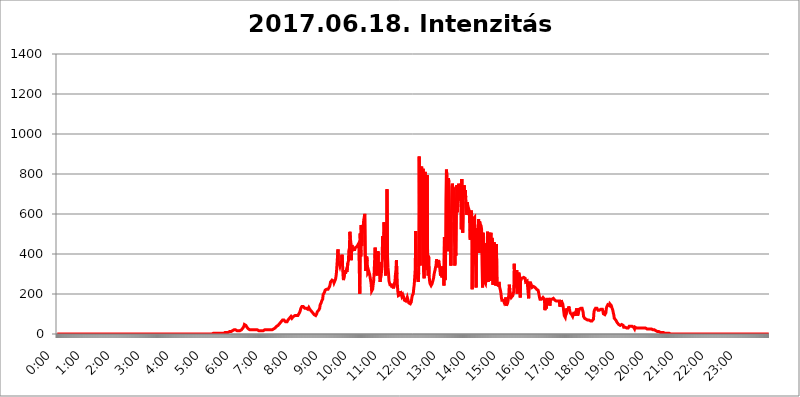
| Category | 2017.06.18. Intenzitás [W/m^2]04 |
|---|---|
| 0.0 | 0 |
| 0.0006944444444444445 | 0 |
| 0.001388888888888889 | 0 |
| 0.0020833333333333333 | 0 |
| 0.002777777777777778 | 0 |
| 0.003472222222222222 | 0 |
| 0.004166666666666667 | 0 |
| 0.004861111111111111 | 0 |
| 0.005555555555555556 | 0 |
| 0.0062499999999999995 | 0 |
| 0.006944444444444444 | 0 |
| 0.007638888888888889 | 0 |
| 0.008333333333333333 | 0 |
| 0.009027777777777779 | 0 |
| 0.009722222222222222 | 0 |
| 0.010416666666666666 | 0 |
| 0.011111111111111112 | 0 |
| 0.011805555555555555 | 0 |
| 0.012499999999999999 | 0 |
| 0.013194444444444444 | 0 |
| 0.013888888888888888 | 0 |
| 0.014583333333333332 | 0 |
| 0.015277777777777777 | 0 |
| 0.015972222222222224 | 0 |
| 0.016666666666666666 | 0 |
| 0.017361111111111112 | 0 |
| 0.018055555555555557 | 0 |
| 0.01875 | 0 |
| 0.019444444444444445 | 0 |
| 0.02013888888888889 | 0 |
| 0.020833333333333332 | 0 |
| 0.02152777777777778 | 0 |
| 0.022222222222222223 | 0 |
| 0.02291666666666667 | 0 |
| 0.02361111111111111 | 0 |
| 0.024305555555555556 | 0 |
| 0.024999999999999998 | 0 |
| 0.025694444444444447 | 0 |
| 0.02638888888888889 | 0 |
| 0.027083333333333334 | 0 |
| 0.027777777777777776 | 0 |
| 0.02847222222222222 | 0 |
| 0.029166666666666664 | 0 |
| 0.029861111111111113 | 0 |
| 0.030555555555555555 | 0 |
| 0.03125 | 0 |
| 0.03194444444444445 | 0 |
| 0.03263888888888889 | 0 |
| 0.03333333333333333 | 0 |
| 0.034027777777777775 | 0 |
| 0.034722222222222224 | 0 |
| 0.035416666666666666 | 0 |
| 0.036111111111111115 | 0 |
| 0.03680555555555556 | 0 |
| 0.0375 | 0 |
| 0.03819444444444444 | 0 |
| 0.03888888888888889 | 0 |
| 0.03958333333333333 | 0 |
| 0.04027777777777778 | 0 |
| 0.04097222222222222 | 0 |
| 0.041666666666666664 | 0 |
| 0.042361111111111106 | 0 |
| 0.04305555555555556 | 0 |
| 0.043750000000000004 | 0 |
| 0.044444444444444446 | 0 |
| 0.04513888888888889 | 0 |
| 0.04583333333333334 | 0 |
| 0.04652777777777778 | 0 |
| 0.04722222222222222 | 0 |
| 0.04791666666666666 | 0 |
| 0.04861111111111111 | 0 |
| 0.049305555555555554 | 0 |
| 0.049999999999999996 | 0 |
| 0.05069444444444445 | 0 |
| 0.051388888888888894 | 0 |
| 0.052083333333333336 | 0 |
| 0.05277777777777778 | 0 |
| 0.05347222222222222 | 0 |
| 0.05416666666666667 | 0 |
| 0.05486111111111111 | 0 |
| 0.05555555555555555 | 0 |
| 0.05625 | 0 |
| 0.05694444444444444 | 0 |
| 0.057638888888888885 | 0 |
| 0.05833333333333333 | 0 |
| 0.05902777777777778 | 0 |
| 0.059722222222222225 | 0 |
| 0.06041666666666667 | 0 |
| 0.061111111111111116 | 0 |
| 0.06180555555555556 | 0 |
| 0.0625 | 0 |
| 0.06319444444444444 | 0 |
| 0.06388888888888888 | 0 |
| 0.06458333333333334 | 0 |
| 0.06527777777777778 | 0 |
| 0.06597222222222222 | 0 |
| 0.06666666666666667 | 0 |
| 0.06736111111111111 | 0 |
| 0.06805555555555555 | 0 |
| 0.06874999999999999 | 0 |
| 0.06944444444444443 | 0 |
| 0.07013888888888889 | 0 |
| 0.07083333333333333 | 0 |
| 0.07152777777777779 | 0 |
| 0.07222222222222223 | 0 |
| 0.07291666666666667 | 0 |
| 0.07361111111111111 | 0 |
| 0.07430555555555556 | 0 |
| 0.075 | 0 |
| 0.07569444444444444 | 0 |
| 0.0763888888888889 | 0 |
| 0.07708333333333334 | 0 |
| 0.07777777777777778 | 0 |
| 0.07847222222222222 | 0 |
| 0.07916666666666666 | 0 |
| 0.0798611111111111 | 0 |
| 0.08055555555555556 | 0 |
| 0.08125 | 0 |
| 0.08194444444444444 | 0 |
| 0.08263888888888889 | 0 |
| 0.08333333333333333 | 0 |
| 0.08402777777777777 | 0 |
| 0.08472222222222221 | 0 |
| 0.08541666666666665 | 0 |
| 0.08611111111111112 | 0 |
| 0.08680555555555557 | 0 |
| 0.08750000000000001 | 0 |
| 0.08819444444444445 | 0 |
| 0.08888888888888889 | 0 |
| 0.08958333333333333 | 0 |
| 0.09027777777777778 | 0 |
| 0.09097222222222222 | 0 |
| 0.09166666666666667 | 0 |
| 0.09236111111111112 | 0 |
| 0.09305555555555556 | 0 |
| 0.09375 | 0 |
| 0.09444444444444444 | 0 |
| 0.09513888888888888 | 0 |
| 0.09583333333333333 | 0 |
| 0.09652777777777777 | 0 |
| 0.09722222222222222 | 0 |
| 0.09791666666666667 | 0 |
| 0.09861111111111111 | 0 |
| 0.09930555555555555 | 0 |
| 0.09999999999999999 | 0 |
| 0.10069444444444443 | 0 |
| 0.1013888888888889 | 0 |
| 0.10208333333333335 | 0 |
| 0.10277777777777779 | 0 |
| 0.10347222222222223 | 0 |
| 0.10416666666666667 | 0 |
| 0.10486111111111111 | 0 |
| 0.10555555555555556 | 0 |
| 0.10625 | 0 |
| 0.10694444444444444 | 0 |
| 0.1076388888888889 | 0 |
| 0.10833333333333334 | 0 |
| 0.10902777777777778 | 0 |
| 0.10972222222222222 | 0 |
| 0.1111111111111111 | 0 |
| 0.11180555555555556 | 0 |
| 0.11180555555555556 | 0 |
| 0.1125 | 0 |
| 0.11319444444444444 | 0 |
| 0.11388888888888889 | 0 |
| 0.11458333333333333 | 0 |
| 0.11527777777777777 | 0 |
| 0.11597222222222221 | 0 |
| 0.11666666666666665 | 0 |
| 0.1173611111111111 | 0 |
| 0.11805555555555557 | 0 |
| 0.11944444444444445 | 0 |
| 0.12013888888888889 | 0 |
| 0.12083333333333333 | 0 |
| 0.12152777777777778 | 0 |
| 0.12222222222222223 | 0 |
| 0.12291666666666667 | 0 |
| 0.12291666666666667 | 0 |
| 0.12361111111111112 | 0 |
| 0.12430555555555556 | 0 |
| 0.125 | 0 |
| 0.12569444444444444 | 0 |
| 0.12638888888888888 | 0 |
| 0.12708333333333333 | 0 |
| 0.16875 | 0 |
| 0.12847222222222224 | 0 |
| 0.12916666666666668 | 0 |
| 0.12986111111111112 | 0 |
| 0.13055555555555556 | 0 |
| 0.13125 | 0 |
| 0.13194444444444445 | 0 |
| 0.1326388888888889 | 0 |
| 0.13333333333333333 | 0 |
| 0.13402777777777777 | 0 |
| 0.13402777777777777 | 0 |
| 0.13472222222222222 | 0 |
| 0.13541666666666666 | 0 |
| 0.1361111111111111 | 0 |
| 0.13749999999999998 | 0 |
| 0.13819444444444443 | 0 |
| 0.1388888888888889 | 0 |
| 0.13958333333333334 | 0 |
| 0.14027777777777778 | 0 |
| 0.14097222222222222 | 0 |
| 0.14166666666666666 | 0 |
| 0.1423611111111111 | 0 |
| 0.14305555555555557 | 0 |
| 0.14375000000000002 | 0 |
| 0.14444444444444446 | 0 |
| 0.1451388888888889 | 0 |
| 0.1451388888888889 | 0 |
| 0.14652777777777778 | 0 |
| 0.14722222222222223 | 0 |
| 0.14791666666666667 | 0 |
| 0.1486111111111111 | 0 |
| 0.14930555555555555 | 0 |
| 0.15 | 0 |
| 0.15069444444444444 | 0 |
| 0.15138888888888888 | 0 |
| 0.15208333333333332 | 0 |
| 0.15277777777777776 | 0 |
| 0.15347222222222223 | 0 |
| 0.15416666666666667 | 0 |
| 0.15486111111111112 | 0 |
| 0.15555555555555556 | 0 |
| 0.15625 | 0 |
| 0.15694444444444444 | 0 |
| 0.15763888888888888 | 0 |
| 0.15833333333333333 | 0 |
| 0.15902777777777777 | 0 |
| 0.15972222222222224 | 0 |
| 0.16041666666666668 | 0 |
| 0.16111111111111112 | 0 |
| 0.16180555555555556 | 0 |
| 0.1625 | 0 |
| 0.16319444444444445 | 0 |
| 0.1638888888888889 | 0 |
| 0.16458333333333333 | 0 |
| 0.16527777777777777 | 0 |
| 0.16597222222222222 | 0 |
| 0.16666666666666666 | 0 |
| 0.1673611111111111 | 0 |
| 0.16805555555555554 | 0 |
| 0.16874999999999998 | 0 |
| 0.16944444444444443 | 0 |
| 0.17013888888888887 | 0 |
| 0.1708333333333333 | 0 |
| 0.17152777777777775 | 0 |
| 0.17222222222222225 | 0 |
| 0.1729166666666667 | 0 |
| 0.17361111111111113 | 0 |
| 0.17430555555555557 | 0 |
| 0.17500000000000002 | 0 |
| 0.17569444444444446 | 0 |
| 0.1763888888888889 | 0 |
| 0.17708333333333334 | 0 |
| 0.17777777777777778 | 0 |
| 0.17847222222222223 | 0 |
| 0.17916666666666667 | 0 |
| 0.1798611111111111 | 0 |
| 0.18055555555555555 | 0 |
| 0.18125 | 0 |
| 0.18194444444444444 | 0 |
| 0.1826388888888889 | 0 |
| 0.18333333333333335 | 0 |
| 0.1840277777777778 | 0 |
| 0.18472222222222223 | 0 |
| 0.18541666666666667 | 0 |
| 0.18611111111111112 | 0 |
| 0.18680555555555556 | 0 |
| 0.1875 | 0 |
| 0.18819444444444444 | 0 |
| 0.18888888888888888 | 0 |
| 0.18958333333333333 | 0 |
| 0.19027777777777777 | 0 |
| 0.1909722222222222 | 0 |
| 0.19166666666666665 | 0 |
| 0.19236111111111112 | 0 |
| 0.19305555555555554 | 0 |
| 0.19375 | 0 |
| 0.19444444444444445 | 0 |
| 0.1951388888888889 | 0 |
| 0.19583333333333333 | 0 |
| 0.19652777777777777 | 0 |
| 0.19722222222222222 | 0 |
| 0.19791666666666666 | 0 |
| 0.1986111111111111 | 0 |
| 0.19930555555555554 | 0 |
| 0.19999999999999998 | 0 |
| 0.20069444444444443 | 0 |
| 0.20138888888888887 | 0 |
| 0.2020833333333333 | 0 |
| 0.2027777777777778 | 0 |
| 0.2034722222222222 | 0 |
| 0.2041666666666667 | 0 |
| 0.20486111111111113 | 0 |
| 0.20555555555555557 | 0 |
| 0.20625000000000002 | 0 |
| 0.20694444444444446 | 0 |
| 0.2076388888888889 | 0 |
| 0.20833333333333334 | 0 |
| 0.20902777777777778 | 0 |
| 0.20972222222222223 | 0 |
| 0.21041666666666667 | 0 |
| 0.2111111111111111 | 0 |
| 0.21180555555555555 | 0 |
| 0.2125 | 0 |
| 0.21319444444444444 | 0 |
| 0.2138888888888889 | 0 |
| 0.21458333333333335 | 0 |
| 0.2152777777777778 | 0 |
| 0.21597222222222223 | 0 |
| 0.21666666666666667 | 0 |
| 0.21736111111111112 | 0 |
| 0.21805555555555556 | 3.525 |
| 0.21875 | 3.525 |
| 0.21944444444444444 | 3.525 |
| 0.22013888888888888 | 3.525 |
| 0.22083333333333333 | 3.525 |
| 0.22152777777777777 | 3.525 |
| 0.2222222222222222 | 3.525 |
| 0.22291666666666665 | 3.525 |
| 0.2236111111111111 | 3.525 |
| 0.22430555555555556 | 3.525 |
| 0.225 | 3.525 |
| 0.22569444444444445 | 3.525 |
| 0.2263888888888889 | 3.525 |
| 0.22708333333333333 | 3.525 |
| 0.22777777777777777 | 3.525 |
| 0.22847222222222222 | 3.525 |
| 0.22916666666666666 | 3.525 |
| 0.2298611111111111 | 3.525 |
| 0.23055555555555554 | 3.525 |
| 0.23124999999999998 | 3.525 |
| 0.23194444444444443 | 3.525 |
| 0.23263888888888887 | 3.525 |
| 0.2333333333333333 | 3.525 |
| 0.2340277777777778 | 3.525 |
| 0.2347222222222222 | 3.525 |
| 0.2354166666666667 | 7.887 |
| 0.23611111111111113 | 3.525 |
| 0.23680555555555557 | 7.887 |
| 0.23750000000000002 | 7.887 |
| 0.23819444444444446 | 7.887 |
| 0.2388888888888889 | 7.887 |
| 0.23958333333333334 | 7.887 |
| 0.24027777777777778 | 7.887 |
| 0.24097222222222223 | 12.257 |
| 0.24166666666666667 | 12.257 |
| 0.2423611111111111 | 12.257 |
| 0.24305555555555555 | 12.257 |
| 0.24375 | 12.257 |
| 0.24444444444444446 | 16.636 |
| 0.24513888888888888 | 16.636 |
| 0.24583333333333335 | 16.636 |
| 0.2465277777777778 | 21.024 |
| 0.24722222222222223 | 21.024 |
| 0.24791666666666667 | 21.024 |
| 0.24861111111111112 | 16.636 |
| 0.24930555555555556 | 21.024 |
| 0.25 | 21.024 |
| 0.25069444444444444 | 21.024 |
| 0.2513888888888889 | 16.636 |
| 0.2520833333333333 | 16.636 |
| 0.25277777777777777 | 16.636 |
| 0.2534722222222222 | 16.636 |
| 0.25416666666666665 | 16.636 |
| 0.2548611111111111 | 16.636 |
| 0.2555555555555556 | 16.636 |
| 0.25625000000000003 | 16.636 |
| 0.2569444444444445 | 16.636 |
| 0.2576388888888889 | 16.636 |
| 0.25833333333333336 | 21.024 |
| 0.2590277777777778 | 21.024 |
| 0.25972222222222224 | 25.419 |
| 0.2604166666666667 | 29.823 |
| 0.2611111111111111 | 34.234 |
| 0.26180555555555557 | 38.653 |
| 0.2625 | 47.511 |
| 0.26319444444444445 | 47.511 |
| 0.2638888888888889 | 47.511 |
| 0.26458333333333334 | 43.079 |
| 0.2652777777777778 | 38.653 |
| 0.2659722222222222 | 34.234 |
| 0.26666666666666666 | 34.234 |
| 0.2673611111111111 | 29.823 |
| 0.26805555555555555 | 25.419 |
| 0.26875 | 25.419 |
| 0.26944444444444443 | 25.419 |
| 0.2701388888888889 | 21.024 |
| 0.2708333333333333 | 25.419 |
| 0.27152777777777776 | 21.024 |
| 0.2722222222222222 | 21.024 |
| 0.27291666666666664 | 21.024 |
| 0.2736111111111111 | 21.024 |
| 0.2743055555555555 | 21.024 |
| 0.27499999999999997 | 21.024 |
| 0.27569444444444446 | 21.024 |
| 0.27638888888888885 | 21.024 |
| 0.27708333333333335 | 21.024 |
| 0.2777777777777778 | 21.024 |
| 0.27847222222222223 | 21.024 |
| 0.2791666666666667 | 21.024 |
| 0.2798611111111111 | 21.024 |
| 0.28055555555555556 | 21.024 |
| 0.28125 | 16.636 |
| 0.28194444444444444 | 16.636 |
| 0.2826388888888889 | 16.636 |
| 0.2833333333333333 | 16.636 |
| 0.28402777777777777 | 16.636 |
| 0.2847222222222222 | 16.636 |
| 0.28541666666666665 | 16.636 |
| 0.28611111111111115 | 16.636 |
| 0.28680555555555554 | 16.636 |
| 0.28750000000000003 | 16.636 |
| 0.2881944444444445 | 16.636 |
| 0.2888888888888889 | 16.636 |
| 0.28958333333333336 | 16.636 |
| 0.2902777777777778 | 16.636 |
| 0.29097222222222224 | 21.024 |
| 0.2916666666666667 | 21.024 |
| 0.2923611111111111 | 21.024 |
| 0.29305555555555557 | 21.024 |
| 0.29375 | 21.024 |
| 0.29444444444444445 | 21.024 |
| 0.2951388888888889 | 21.024 |
| 0.29583333333333334 | 21.024 |
| 0.2965277777777778 | 21.024 |
| 0.2972222222222222 | 21.024 |
| 0.29791666666666666 | 21.024 |
| 0.2986111111111111 | 21.024 |
| 0.29930555555555555 | 21.024 |
| 0.3 | 21.024 |
| 0.30069444444444443 | 21.024 |
| 0.3013888888888889 | 21.024 |
| 0.3020833333333333 | 21.024 |
| 0.30277777777777776 | 25.419 |
| 0.3034722222222222 | 25.419 |
| 0.30416666666666664 | 29.823 |
| 0.3048611111111111 | 29.823 |
| 0.3055555555555555 | 29.823 |
| 0.30624999999999997 | 34.234 |
| 0.3069444444444444 | 34.234 |
| 0.3076388888888889 | 38.653 |
| 0.30833333333333335 | 38.653 |
| 0.3090277777777778 | 38.653 |
| 0.30972222222222223 | 43.079 |
| 0.3104166666666667 | 43.079 |
| 0.3111111111111111 | 47.511 |
| 0.31180555555555556 | 51.951 |
| 0.3125 | 56.398 |
| 0.31319444444444444 | 56.398 |
| 0.3138888888888889 | 60.85 |
| 0.3145833333333333 | 65.31 |
| 0.31527777777777777 | 65.31 |
| 0.3159722222222222 | 69.775 |
| 0.31666666666666665 | 69.775 |
| 0.31736111111111115 | 69.775 |
| 0.31805555555555554 | 69.775 |
| 0.31875000000000003 | 65.31 |
| 0.3194444444444445 | 65.31 |
| 0.3201388888888889 | 60.85 |
| 0.32083333333333336 | 60.85 |
| 0.3215277777777778 | 60.85 |
| 0.32222222222222224 | 60.85 |
| 0.3229166666666667 | 65.31 |
| 0.3236111111111111 | 69.775 |
| 0.32430555555555557 | 74.246 |
| 0.325 | 74.246 |
| 0.32569444444444445 | 78.722 |
| 0.3263888888888889 | 78.722 |
| 0.32708333333333334 | 83.205 |
| 0.3277777777777778 | 87.692 |
| 0.3284722222222222 | 83.205 |
| 0.32916666666666666 | 78.722 |
| 0.3298611111111111 | 78.722 |
| 0.33055555555555555 | 83.205 |
| 0.33125 | 87.692 |
| 0.33194444444444443 | 92.184 |
| 0.3326388888888889 | 92.184 |
| 0.3333333333333333 | 92.184 |
| 0.3340277777777778 | 92.184 |
| 0.3347222222222222 | 92.184 |
| 0.3354166666666667 | 92.184 |
| 0.3361111111111111 | 92.184 |
| 0.3368055555555556 | 92.184 |
| 0.33749999999999997 | 92.184 |
| 0.33819444444444446 | 96.682 |
| 0.33888888888888885 | 101.184 |
| 0.33958333333333335 | 105.69 |
| 0.34027777777777773 | 110.201 |
| 0.34097222222222223 | 119.235 |
| 0.3416666666666666 | 128.284 |
| 0.3423611111111111 | 132.814 |
| 0.3430555555555555 | 137.347 |
| 0.34375 | 141.884 |
| 0.3444444444444445 | 141.884 |
| 0.3451388888888889 | 137.347 |
| 0.3458333333333334 | 137.347 |
| 0.34652777777777777 | 132.814 |
| 0.34722222222222227 | 128.284 |
| 0.34791666666666665 | 128.284 |
| 0.34861111111111115 | 128.284 |
| 0.34930555555555554 | 128.284 |
| 0.35000000000000003 | 128.284 |
| 0.3506944444444444 | 123.758 |
| 0.3513888888888889 | 123.758 |
| 0.3520833333333333 | 128.284 |
| 0.3527777777777778 | 132.814 |
| 0.3534722222222222 | 132.814 |
| 0.3541666666666667 | 123.758 |
| 0.3548611111111111 | 119.235 |
| 0.35555555555555557 | 119.235 |
| 0.35625 | 114.716 |
| 0.35694444444444445 | 114.716 |
| 0.3576388888888889 | 110.201 |
| 0.35833333333333334 | 105.69 |
| 0.3590277777777778 | 101.184 |
| 0.3597222222222222 | 101.184 |
| 0.36041666666666666 | 96.682 |
| 0.3611111111111111 | 96.682 |
| 0.36180555555555555 | 96.682 |
| 0.3625 | 92.184 |
| 0.36319444444444443 | 96.682 |
| 0.3638888888888889 | 101.184 |
| 0.3645833333333333 | 110.201 |
| 0.3652777777777778 | 114.716 |
| 0.3659722222222222 | 114.716 |
| 0.3666666666666667 | 119.235 |
| 0.3673611111111111 | 119.235 |
| 0.3680555555555556 | 128.284 |
| 0.36874999999999997 | 146.423 |
| 0.36944444444444446 | 146.423 |
| 0.37013888888888885 | 155.509 |
| 0.37083333333333335 | 164.605 |
| 0.37152777777777773 | 169.156 |
| 0.37222222222222223 | 173.709 |
| 0.3729166666666666 | 196.497 |
| 0.3736111111111111 | 201.058 |
| 0.3743055555555555 | 201.058 |
| 0.375 | 210.182 |
| 0.3756944444444445 | 219.309 |
| 0.3763888888888889 | 214.746 |
| 0.3770833333333334 | 219.309 |
| 0.37777777777777777 | 223.873 |
| 0.37847222222222227 | 219.309 |
| 0.37916666666666665 | 219.309 |
| 0.37986111111111115 | 223.873 |
| 0.38055555555555554 | 228.436 |
| 0.38125000000000003 | 228.436 |
| 0.3819444444444444 | 237.564 |
| 0.3826388888888889 | 246.689 |
| 0.3833333333333333 | 260.373 |
| 0.3840277777777778 | 264.932 |
| 0.3847222222222222 | 264.932 |
| 0.3854166666666667 | 269.49 |
| 0.3861111111111111 | 274.047 |
| 0.38680555555555557 | 269.49 |
| 0.3875 | 264.932 |
| 0.38819444444444445 | 255.813 |
| 0.3888888888888889 | 251.251 |
| 0.38958333333333334 | 260.373 |
| 0.3902777777777778 | 274.047 |
| 0.3909722222222222 | 287.709 |
| 0.39166666666666666 | 310.44 |
| 0.3923611111111111 | 310.44 |
| 0.39305555555555555 | 314.98 |
| 0.39375 | 422.943 |
| 0.39444444444444443 | 346.682 |
| 0.3951388888888889 | 360.221 |
| 0.3958333333333333 | 346.682 |
| 0.3965277777777778 | 337.639 |
| 0.3972222222222222 | 346.682 |
| 0.3979166666666667 | 364.728 |
| 0.3986111111111111 | 342.162 |
| 0.3993055555555556 | 396.164 |
| 0.39999999999999997 | 360.221 |
| 0.40069444444444446 | 301.354 |
| 0.40138888888888885 | 269.49 |
| 0.40208333333333335 | 274.047 |
| 0.40277777777777773 | 296.808 |
| 0.40347222222222223 | 319.517 |
| 0.4041666666666666 | 301.354 |
| 0.4048611111111111 | 310.44 |
| 0.4055555555555555 | 319.517 |
| 0.40625 | 310.44 |
| 0.4069444444444445 | 310.44 |
| 0.4076388888888889 | 355.712 |
| 0.4083333333333334 | 364.728 |
| 0.40902777777777777 | 418.492 |
| 0.40972222222222227 | 427.39 |
| 0.41041666666666665 | 510.885 |
| 0.41111111111111115 | 475.972 |
| 0.41180555555555554 | 458.38 |
| 0.41250000000000003 | 369.23 |
| 0.4131944444444444 | 445.129 |
| 0.4138888888888889 | 431.833 |
| 0.4145833333333333 | 427.39 |
| 0.4152777777777778 | 422.943 |
| 0.4159722222222222 | 422.943 |
| 0.4166666666666667 | 422.943 |
| 0.4173611111111111 | 422.943 |
| 0.41805555555555557 | 431.833 |
| 0.41875 | 431.833 |
| 0.41944444444444445 | 436.27 |
| 0.4201388888888889 | 436.27 |
| 0.42083333333333334 | 440.702 |
| 0.4215277777777778 | 445.129 |
| 0.4222222222222222 | 449.551 |
| 0.42291666666666666 | 453.968 |
| 0.4236111111111111 | 458.38 |
| 0.42430555555555555 | 201.058 |
| 0.425 | 502.192 |
| 0.42569444444444443 | 387.202 |
| 0.4263888888888889 | 545.416 |
| 0.4270833333333333 | 440.702 |
| 0.4277777777777778 | 523.88 |
| 0.4284722222222222 | 523.88 |
| 0.4291666666666667 | 541.121 |
| 0.4298611111111111 | 571.049 |
| 0.4305555555555556 | 583.779 |
| 0.43124999999999997 | 600.661 |
| 0.43194444444444446 | 387.202 |
| 0.43263888888888885 | 314.98 |
| 0.43333333333333335 | 342.162 |
| 0.43402777777777773 | 387.202 |
| 0.43472222222222223 | 364.728 |
| 0.4354166666666666 | 305.898 |
| 0.4361111111111111 | 305.898 |
| 0.4368055555555555 | 314.98 |
| 0.4375 | 305.898 |
| 0.4381944444444445 | 296.808 |
| 0.4388888888888889 | 296.808 |
| 0.4395833333333334 | 301.354 |
| 0.44027777777777777 | 251.251 |
| 0.44097222222222227 | 214.746 |
| 0.44166666666666665 | 214.746 |
| 0.44236111111111115 | 223.873 |
| 0.44305555555555554 | 246.689 |
| 0.44375000000000003 | 264.932 |
| 0.4444444444444444 | 305.898 |
| 0.4451388888888889 | 310.44 |
| 0.4458333333333333 | 431.833 |
| 0.4465277777777778 | 328.584 |
| 0.4472222222222222 | 305.898 |
| 0.4479166666666667 | 305.898 |
| 0.4486111111111111 | 292.259 |
| 0.44930555555555557 | 328.584 |
| 0.45 | 414.035 |
| 0.45069444444444445 | 301.354 |
| 0.4513888888888889 | 360.221 |
| 0.45208333333333334 | 296.808 |
| 0.4527777777777778 | 260.373 |
| 0.4534722222222222 | 278.603 |
| 0.45416666666666666 | 287.709 |
| 0.4548611111111111 | 283.156 |
| 0.45555555555555555 | 342.162 |
| 0.45625 | 489.108 |
| 0.45694444444444443 | 373.729 |
| 0.4576388888888889 | 414.035 |
| 0.4583333333333333 | 558.261 |
| 0.4590277777777778 | 387.202 |
| 0.4597222222222222 | 378.224 |
| 0.4604166666666667 | 292.259 |
| 0.4611111111111111 | 292.259 |
| 0.4618055555555556 | 449.551 |
| 0.46249999999999997 | 723.889 |
| 0.46319444444444446 | 391.685 |
| 0.46388888888888885 | 333.113 |
| 0.46458333333333335 | 305.898 |
| 0.46527777777777773 | 264.932 |
| 0.46597222222222223 | 255.813 |
| 0.4666666666666666 | 246.689 |
| 0.4673611111111111 | 242.127 |
| 0.4680555555555555 | 242.127 |
| 0.46875 | 246.689 |
| 0.4694444444444445 | 233 |
| 0.4701388888888889 | 246.689 |
| 0.4708333333333334 | 242.127 |
| 0.47152777777777777 | 228.436 |
| 0.47222222222222227 | 228.436 |
| 0.47291666666666665 | 233 |
| 0.47361111111111115 | 260.373 |
| 0.47430555555555554 | 296.808 |
| 0.47500000000000003 | 319.517 |
| 0.4756944444444444 | 369.23 |
| 0.4763888888888889 | 301.354 |
| 0.4770833333333333 | 242.127 |
| 0.4777777777777778 | 210.182 |
| 0.4784722222222222 | 191.937 |
| 0.4791666666666667 | 187.378 |
| 0.4798611111111111 | 187.378 |
| 0.48055555555555557 | 196.497 |
| 0.48125 | 214.746 |
| 0.48194444444444445 | 210.182 |
| 0.4826388888888889 | 196.497 |
| 0.48333333333333334 | 187.378 |
| 0.4840277777777778 | 187.378 |
| 0.4847222222222222 | 196.497 |
| 0.48541666666666666 | 191.937 |
| 0.4861111111111111 | 182.82 |
| 0.48680555555555555 | 169.156 |
| 0.4875 | 164.605 |
| 0.48819444444444443 | 169.156 |
| 0.4888888888888889 | 164.605 |
| 0.4895833333333333 | 169.156 |
| 0.4902777777777778 | 173.709 |
| 0.4909722222222222 | 182.82 |
| 0.4916666666666667 | 182.82 |
| 0.4923611111111111 | 164.605 |
| 0.4930555555555556 | 155.509 |
| 0.49374999999999997 | 160.056 |
| 0.49444444444444446 | 155.509 |
| 0.49513888888888885 | 150.964 |
| 0.49583333333333335 | 150.964 |
| 0.49652777777777773 | 160.056 |
| 0.49722222222222223 | 178.264 |
| 0.4979166666666666 | 191.937 |
| 0.4986111111111111 | 196.497 |
| 0.4993055555555555 | 201.058 |
| 0.5 | 228.436 |
| 0.5006944444444444 | 246.689 |
| 0.5013888888888889 | 251.251 |
| 0.5020833333333333 | 324.052 |
| 0.5027777777777778 | 515.223 |
| 0.5034722222222222 | 333.113 |
| 0.5041666666666667 | 287.709 |
| 0.5048611111111111 | 301.354 |
| 0.5055555555555555 | 274.047 |
| 0.50625 | 260.373 |
| 0.5069444444444444 | 305.898 |
| 0.5076388888888889 | 887.309 |
| 0.5083333333333333 | 467.187 |
| 0.5090277777777777 | 342.162 |
| 0.5097222222222222 | 663.019 |
| 0.5104166666666666 | 829.981 |
| 0.5111111111111112 | 837.682 |
| 0.5118055555555555 | 609.062 |
| 0.5125000000000001 | 629.948 |
| 0.5131944444444444 | 826.123 |
| 0.513888888888889 | 310.44 |
| 0.5145833333333333 | 278.603 |
| 0.5152777777777778 | 625.784 |
| 0.5159722222222222 | 810.641 |
| 0.5166666666666667 | 506.542 |
| 0.517361111111111 | 378.224 |
| 0.5180555555555556 | 319.517 |
| 0.5187499999999999 | 795.074 |
| 0.5194444444444445 | 364.728 |
| 0.5201388888888888 | 292.259 |
| 0.5208333333333334 | 391.685 |
| 0.5215277777777778 | 296.808 |
| 0.5222222222222223 | 264.932 |
| 0.5229166666666667 | 251.251 |
| 0.5236111111111111 | 251.251 |
| 0.5243055555555556 | 242.127 |
| 0.525 | 246.689 |
| 0.5256944444444445 | 251.251 |
| 0.5263888888888889 | 255.813 |
| 0.5270833333333333 | 269.49 |
| 0.5277777777777778 | 278.603 |
| 0.5284722222222222 | 296.808 |
| 0.5291666666666667 | 310.44 |
| 0.5298611111111111 | 319.517 |
| 0.5305555555555556 | 333.113 |
| 0.53125 | 342.162 |
| 0.5319444444444444 | 373.729 |
| 0.5326388888888889 | 364.728 |
| 0.5333333333333333 | 333.113 |
| 0.5340277777777778 | 351.198 |
| 0.5347222222222222 | 369.23 |
| 0.5354166666666667 | 360.221 |
| 0.5361111111111111 | 342.162 |
| 0.5368055555555555 | 337.639 |
| 0.5375 | 292.259 |
| 0.5381944444444444 | 296.808 |
| 0.5388888888888889 | 337.639 |
| 0.5395833333333333 | 283.156 |
| 0.5402777777777777 | 278.603 |
| 0.5409722222222222 | 314.98 |
| 0.5416666666666666 | 296.808 |
| 0.5423611111111112 | 242.127 |
| 0.5430555555555555 | 484.735 |
| 0.5437500000000001 | 269.49 |
| 0.5444444444444444 | 283.156 |
| 0.545138888888889 | 667.123 |
| 0.5458333333333333 | 822.26 |
| 0.5465277777777778 | 787.258 |
| 0.5472222222222222 | 691.608 |
| 0.5479166666666667 | 414.035 |
| 0.548611111111111 | 779.42 |
| 0.5493055555555556 | 759.723 |
| 0.5499999999999999 | 566.793 |
| 0.5506944444444445 | 449.551 |
| 0.5513888888888888 | 617.436 |
| 0.5520833333333334 | 342.162 |
| 0.5527777777777778 | 558.261 |
| 0.5534722222222223 | 735.89 |
| 0.5541666666666667 | 751.803 |
| 0.5548611111111111 | 747.834 |
| 0.5555555555555556 | 699.717 |
| 0.55625 | 731.896 |
| 0.5569444444444445 | 523.88 |
| 0.5576388888888889 | 342.162 |
| 0.5583333333333333 | 427.39 |
| 0.5590277777777778 | 391.685 |
| 0.5597222222222222 | 638.256 |
| 0.5604166666666667 | 743.859 |
| 0.5611111111111111 | 609.062 |
| 0.5618055555555556 | 650.667 |
| 0.5625 | 687.544 |
| 0.5631944444444444 | 751.803 |
| 0.5638888888888889 | 667.123 |
| 0.5645833333333333 | 743.859 |
| 0.5652777777777778 | 743.859 |
| 0.5659722222222222 | 711.832 |
| 0.5666666666666667 | 523.88 |
| 0.5673611111111111 | 775.492 |
| 0.5680555555555555 | 528.2 |
| 0.56875 | 506.542 |
| 0.5694444444444444 | 663.019 |
| 0.5701388888888889 | 719.877 |
| 0.5708333333333333 | 743.859 |
| 0.5715277777777777 | 687.544 |
| 0.5722222222222222 | 719.877 |
| 0.5729166666666666 | 683.473 |
| 0.5736111111111112 | 687.544 |
| 0.5743055555555555 | 596.45 |
| 0.5750000000000001 | 658.909 |
| 0.5756944444444444 | 642.4 |
| 0.576388888888889 | 634.105 |
| 0.5770833333333333 | 625.784 |
| 0.5777777777777778 | 617.436 |
| 0.5784722222222222 | 621.613 |
| 0.5791666666666667 | 471.582 |
| 0.579861111111111 | 609.062 |
| 0.5805555555555556 | 617.436 |
| 0.5812499999999999 | 600.661 |
| 0.5819444444444445 | 223.873 |
| 0.5826388888888888 | 553.986 |
| 0.5833333333333334 | 575.299 |
| 0.5840277777777778 | 575.299 |
| 0.5847222222222223 | 571.049 |
| 0.5854166666666667 | 583.779 |
| 0.5861111111111111 | 396.164 |
| 0.5868055555555556 | 337.639 |
| 0.5875 | 233 |
| 0.5881944444444445 | 528.2 |
| 0.5888888888888889 | 510.885 |
| 0.5895833333333333 | 453.968 |
| 0.5902777777777778 | 453.968 |
| 0.5909722222222222 | 575.299 |
| 0.5916666666666667 | 405.108 |
| 0.5923611111111111 | 562.53 |
| 0.5930555555555556 | 549.704 |
| 0.59375 | 545.416 |
| 0.5944444444444444 | 541.121 |
| 0.5951388888888889 | 523.88 |
| 0.5958333333333333 | 342.162 |
| 0.5965277777777778 | 233 |
| 0.5972222222222222 | 506.542 |
| 0.5979166666666667 | 445.129 |
| 0.5986111111111111 | 251.251 |
| 0.5993055555555555 | 260.373 |
| 0.6 | 264.932 |
| 0.6006944444444444 | 251.251 |
| 0.6013888888888889 | 274.047 |
| 0.6020833333333333 | 453.968 |
| 0.6027777777777777 | 274.047 |
| 0.6034722222222222 | 510.885 |
| 0.6041666666666666 | 260.373 |
| 0.6048611111111112 | 475.972 |
| 0.6055555555555555 | 506.542 |
| 0.6062500000000001 | 440.702 |
| 0.6069444444444444 | 264.932 |
| 0.607638888888889 | 489.108 |
| 0.6083333333333333 | 506.542 |
| 0.6090277777777778 | 274.047 |
| 0.6097222222222222 | 480.356 |
| 0.6104166666666667 | 458.38 |
| 0.611111111111111 | 246.689 |
| 0.6118055555555556 | 251.251 |
| 0.6124999999999999 | 458.38 |
| 0.6131944444444445 | 453.968 |
| 0.6138888888888888 | 436.27 |
| 0.6145833333333334 | 242.127 |
| 0.6152777777777778 | 251.251 |
| 0.6159722222222223 | 449.551 |
| 0.6166666666666667 | 264.932 |
| 0.6173611111111111 | 269.49 |
| 0.6180555555555556 | 251.251 |
| 0.61875 | 237.564 |
| 0.6194444444444445 | 260.373 |
| 0.6201388888888889 | 242.127 |
| 0.6208333333333333 | 228.436 |
| 0.6215277777777778 | 219.309 |
| 0.6222222222222222 | 205.62 |
| 0.6229166666666667 | 182.82 |
| 0.6236111111111111 | 169.156 |
| 0.6243055555555556 | 173.709 |
| 0.625 | 173.709 |
| 0.6256944444444444 | 169.156 |
| 0.6263888888888889 | 164.605 |
| 0.6270833333333333 | 155.509 |
| 0.6277777777777778 | 155.509 |
| 0.6284722222222222 | 164.605 |
| 0.6291666666666667 | 182.82 |
| 0.6298611111111111 | 141.884 |
| 0.6305555555555555 | 141.884 |
| 0.63125 | 146.423 |
| 0.6319444444444444 | 160.056 |
| 0.6326388888888889 | 173.709 |
| 0.6333333333333333 | 196.497 |
| 0.6340277777777777 | 246.689 |
| 0.6347222222222222 | 219.309 |
| 0.6354166666666666 | 205.62 |
| 0.6361111111111112 | 191.937 |
| 0.6368055555555555 | 182.82 |
| 0.6375000000000001 | 178.264 |
| 0.6381944444444444 | 187.378 |
| 0.638888888888889 | 191.937 |
| 0.6395833333333333 | 201.058 |
| 0.6402777777777778 | 214.746 |
| 0.6409722222222222 | 351.198 |
| 0.6416666666666667 | 242.127 |
| 0.642361111111111 | 233 |
| 0.6430555555555556 | 233 |
| 0.6437499999999999 | 274.047 |
| 0.6444444444444445 | 319.517 |
| 0.6451388888888888 | 201.058 |
| 0.6458333333333334 | 305.898 |
| 0.6465277777777778 | 210.182 |
| 0.6472222222222223 | 305.898 |
| 0.6479166666666667 | 305.898 |
| 0.6486111111111111 | 283.156 |
| 0.6493055555555556 | 182.82 |
| 0.65 | 278.603 |
| 0.6506944444444445 | 274.047 |
| 0.6513888888888889 | 274.047 |
| 0.6520833333333333 | 278.603 |
| 0.6527777777777778 | 278.603 |
| 0.6534722222222222 | 278.603 |
| 0.6541666666666667 | 283.156 |
| 0.6548611111111111 | 283.156 |
| 0.6555555555555556 | 278.603 |
| 0.65625 | 278.603 |
| 0.6569444444444444 | 260.373 |
| 0.6576388888888889 | 260.373 |
| 0.6583333333333333 | 260.373 |
| 0.6590277777777778 | 264.932 |
| 0.6597222222222222 | 269.49 |
| 0.6604166666666667 | 260.373 |
| 0.6611111111111111 | 178.264 |
| 0.6618055555555555 | 255.813 |
| 0.6625 | 255.813 |
| 0.6631944444444444 | 255.813 |
| 0.6638888888888889 | 255.813 |
| 0.6645833333333333 | 251.251 |
| 0.6652777777777777 | 242.127 |
| 0.6659722222222222 | 233 |
| 0.6666666666666666 | 237.564 |
| 0.6673611111111111 | 237.564 |
| 0.6680555555555556 | 237.564 |
| 0.6687500000000001 | 237.564 |
| 0.6694444444444444 | 233 |
| 0.6701388888888888 | 233 |
| 0.6708333333333334 | 228.436 |
| 0.6715277777777778 | 228.436 |
| 0.6722222222222222 | 223.873 |
| 0.6729166666666666 | 223.873 |
| 0.6736111111111112 | 223.873 |
| 0.6743055555555556 | 219.309 |
| 0.6749999999999999 | 210.182 |
| 0.6756944444444444 | 196.497 |
| 0.6763888888888889 | 182.82 |
| 0.6770833333333334 | 173.709 |
| 0.6777777777777777 | 173.709 |
| 0.6784722222222223 | 173.709 |
| 0.6791666666666667 | 173.709 |
| 0.6798611111111111 | 169.156 |
| 0.6805555555555555 | 173.709 |
| 0.68125 | 182.82 |
| 0.6819444444444445 | 182.82 |
| 0.6826388888888889 | 178.264 |
| 0.6833333333333332 | 173.709 |
| 0.6840277777777778 | 119.235 |
| 0.6847222222222222 | 169.156 |
| 0.6854166666666667 | 173.709 |
| 0.686111111111111 | 128.284 |
| 0.6868055555555556 | 173.709 |
| 0.6875 | 173.709 |
| 0.6881944444444444 | 178.264 |
| 0.688888888888889 | 173.709 |
| 0.6895833333333333 | 173.709 |
| 0.6902777777777778 | 173.709 |
| 0.6909722222222222 | 141.884 |
| 0.6916666666666668 | 173.709 |
| 0.6923611111111111 | 173.709 |
| 0.6930555555555555 | 173.709 |
| 0.69375 | 173.709 |
| 0.6944444444444445 | 173.709 |
| 0.6951388888888889 | 178.264 |
| 0.6958333333333333 | 178.264 |
| 0.6965277777777777 | 173.709 |
| 0.6972222222222223 | 173.709 |
| 0.6979166666666666 | 169.156 |
| 0.6986111111111111 | 164.605 |
| 0.6993055555555556 | 164.605 |
| 0.7000000000000001 | 164.605 |
| 0.7006944444444444 | 164.605 |
| 0.7013888888888888 | 164.605 |
| 0.7020833333333334 | 164.605 |
| 0.7027777777777778 | 164.605 |
| 0.7034722222222222 | 164.605 |
| 0.7041666666666666 | 164.605 |
| 0.7048611111111112 | 137.347 |
| 0.7055555555555556 | 146.423 |
| 0.7062499999999999 | 137.347 |
| 0.7069444444444444 | 169.156 |
| 0.7076388888888889 | 160.056 |
| 0.7083333333333334 | 155.509 |
| 0.7090277777777777 | 150.964 |
| 0.7097222222222223 | 132.814 |
| 0.7104166666666667 | 132.814 |
| 0.7111111111111111 | 92.184 |
| 0.7118055555555555 | 92.184 |
| 0.7125 | 83.205 |
| 0.7131944444444445 | 83.205 |
| 0.7138888888888889 | 87.692 |
| 0.7145833333333332 | 128.284 |
| 0.7152777777777778 | 119.235 |
| 0.7159722222222222 | 128.284 |
| 0.7166666666666667 | 114.716 |
| 0.717361111111111 | 137.347 |
| 0.7180555555555556 | 128.284 |
| 0.71875 | 119.235 |
| 0.7194444444444444 | 105.69 |
| 0.720138888888889 | 105.69 |
| 0.7208333333333333 | 101.184 |
| 0.7215277777777778 | 96.682 |
| 0.7222222222222222 | 92.184 |
| 0.7229166666666668 | 87.692 |
| 0.7236111111111111 | 87.692 |
| 0.7243055555555555 | 92.184 |
| 0.725 | 110.201 |
| 0.7256944444444445 | 92.184 |
| 0.7263888888888889 | 87.692 |
| 0.7270833333333333 | 92.184 |
| 0.7277777777777777 | 114.716 |
| 0.7284722222222223 | 128.284 |
| 0.7291666666666666 | 123.758 |
| 0.7298611111111111 | 92.184 |
| 0.7305555555555556 | 87.692 |
| 0.7312500000000001 | 92.184 |
| 0.7319444444444444 | 123.758 |
| 0.7326388888888888 | 123.758 |
| 0.7333333333333334 | 123.758 |
| 0.7340277777777778 | 128.284 |
| 0.7347222222222222 | 123.758 |
| 0.7354166666666666 | 128.284 |
| 0.7361111111111112 | 128.284 |
| 0.7368055555555556 | 128.284 |
| 0.7374999999999999 | 110.201 |
| 0.7381944444444444 | 87.692 |
| 0.7388888888888889 | 83.205 |
| 0.7395833333333334 | 78.722 |
| 0.7402777777777777 | 78.722 |
| 0.7409722222222223 | 74.246 |
| 0.7416666666666667 | 74.246 |
| 0.7423611111111111 | 74.246 |
| 0.7430555555555555 | 69.775 |
| 0.74375 | 69.775 |
| 0.7444444444444445 | 69.775 |
| 0.7451388888888889 | 69.775 |
| 0.7458333333333332 | 69.775 |
| 0.7465277777777778 | 69.775 |
| 0.7472222222222222 | 69.775 |
| 0.7479166666666667 | 65.31 |
| 0.748611111111111 | 65.31 |
| 0.7493055555555556 | 65.31 |
| 0.75 | 65.31 |
| 0.7506944444444444 | 69.775 |
| 0.751388888888889 | 69.775 |
| 0.7520833333333333 | 74.246 |
| 0.7527777777777778 | 110.201 |
| 0.7534722222222222 | 119.235 |
| 0.7541666666666668 | 123.758 |
| 0.7548611111111111 | 128.284 |
| 0.7555555555555555 | 128.284 |
| 0.75625 | 128.284 |
| 0.7569444444444445 | 128.284 |
| 0.7576388888888889 | 123.758 |
| 0.7583333333333333 | 119.235 |
| 0.7590277777777777 | 119.235 |
| 0.7597222222222223 | 119.235 |
| 0.7604166666666666 | 119.235 |
| 0.7611111111111111 | 119.235 |
| 0.7618055555555556 | 123.758 |
| 0.7625000000000001 | 123.758 |
| 0.7631944444444444 | 123.758 |
| 0.7638888888888888 | 123.758 |
| 0.7645833333333334 | 123.758 |
| 0.7652777777777778 | 114.716 |
| 0.7659722222222222 | 101.184 |
| 0.7666666666666666 | 101.184 |
| 0.7673611111111112 | 96.682 |
| 0.7680555555555556 | 96.682 |
| 0.7687499999999999 | 96.682 |
| 0.7694444444444444 | 105.69 |
| 0.7701388888888889 | 128.284 |
| 0.7708333333333334 | 137.347 |
| 0.7715277777777777 | 141.884 |
| 0.7722222222222223 | 146.423 |
| 0.7729166666666667 | 150.964 |
| 0.7736111111111111 | 150.964 |
| 0.7743055555555555 | 141.884 |
| 0.775 | 150.964 |
| 0.7756944444444445 | 146.423 |
| 0.7763888888888889 | 146.423 |
| 0.7770833333333332 | 141.884 |
| 0.7777777777777778 | 132.814 |
| 0.7784722222222222 | 128.284 |
| 0.7791666666666667 | 119.235 |
| 0.779861111111111 | 105.69 |
| 0.7805555555555556 | 96.682 |
| 0.78125 | 78.722 |
| 0.7819444444444444 | 78.722 |
| 0.782638888888889 | 74.246 |
| 0.7833333333333333 | 69.775 |
| 0.7840277777777778 | 74.246 |
| 0.7847222222222222 | 69.775 |
| 0.7854166666666668 | 56.398 |
| 0.7861111111111111 | 56.398 |
| 0.7868055555555555 | 51.951 |
| 0.7875 | 47.511 |
| 0.7881944444444445 | 43.079 |
| 0.7888888888888889 | 43.079 |
| 0.7895833333333333 | 43.079 |
| 0.7902777777777777 | 43.079 |
| 0.7909722222222223 | 43.079 |
| 0.7916666666666666 | 47.511 |
| 0.7923611111111111 | 43.079 |
| 0.7930555555555556 | 43.079 |
| 0.7937500000000001 | 43.079 |
| 0.7944444444444444 | 34.234 |
| 0.7951388888888888 | 34.234 |
| 0.7958333333333334 | 34.234 |
| 0.7965277777777778 | 34.234 |
| 0.7972222222222222 | 29.823 |
| 0.7979166666666666 | 29.823 |
| 0.7986111111111112 | 29.823 |
| 0.7993055555555556 | 29.823 |
| 0.7999999999999999 | 29.823 |
| 0.8006944444444444 | 29.823 |
| 0.8013888888888889 | 29.823 |
| 0.8020833333333334 | 38.653 |
| 0.8027777777777777 | 38.653 |
| 0.8034722222222223 | 38.653 |
| 0.8041666666666667 | 38.653 |
| 0.8048611111111111 | 38.653 |
| 0.8055555555555555 | 38.653 |
| 0.80625 | 38.653 |
| 0.8069444444444445 | 38.653 |
| 0.8076388888888889 | 34.234 |
| 0.8083333333333332 | 34.234 |
| 0.8090277777777778 | 29.823 |
| 0.8097222222222222 | 25.419 |
| 0.8104166666666667 | 34.234 |
| 0.811111111111111 | 34.234 |
| 0.8118055555555556 | 34.234 |
| 0.8125 | 29.823 |
| 0.8131944444444444 | 29.823 |
| 0.813888888888889 | 29.823 |
| 0.8145833333333333 | 29.823 |
| 0.8152777777777778 | 29.823 |
| 0.8159722222222222 | 29.823 |
| 0.8166666666666668 | 29.823 |
| 0.8173611111111111 | 29.823 |
| 0.8180555555555555 | 29.823 |
| 0.81875 | 29.823 |
| 0.8194444444444445 | 29.823 |
| 0.8201388888888889 | 29.823 |
| 0.8208333333333333 | 29.823 |
| 0.8215277777777777 | 25.419 |
| 0.8222222222222223 | 25.419 |
| 0.8229166666666666 | 29.823 |
| 0.8236111111111111 | 29.823 |
| 0.8243055555555556 | 29.823 |
| 0.8250000000000001 | 29.823 |
| 0.8256944444444444 | 29.823 |
| 0.8263888888888888 | 25.419 |
| 0.8270833333333334 | 25.419 |
| 0.8277777777777778 | 25.419 |
| 0.8284722222222222 | 25.419 |
| 0.8291666666666666 | 25.419 |
| 0.8298611111111112 | 25.419 |
| 0.8305555555555556 | 25.419 |
| 0.8312499999999999 | 25.419 |
| 0.8319444444444444 | 25.419 |
| 0.8326388888888889 | 25.419 |
| 0.8333333333333334 | 25.419 |
| 0.8340277777777777 | 25.419 |
| 0.8347222222222223 | 21.024 |
| 0.8354166666666667 | 21.024 |
| 0.8361111111111111 | 21.024 |
| 0.8368055555555555 | 21.024 |
| 0.8375 | 21.024 |
| 0.8381944444444445 | 21.024 |
| 0.8388888888888889 | 16.636 |
| 0.8395833333333332 | 16.636 |
| 0.8402777777777778 | 16.636 |
| 0.8409722222222222 | 16.636 |
| 0.8416666666666667 | 12.257 |
| 0.842361111111111 | 12.257 |
| 0.8430555555555556 | 12.257 |
| 0.84375 | 12.257 |
| 0.8444444444444444 | 12.257 |
| 0.845138888888889 | 12.257 |
| 0.8458333333333333 | 7.887 |
| 0.8465277777777778 | 7.887 |
| 0.8472222222222222 | 7.887 |
| 0.8479166666666668 | 7.887 |
| 0.8486111111111111 | 7.887 |
| 0.8493055555555555 | 7.887 |
| 0.85 | 7.887 |
| 0.8506944444444445 | 7.887 |
| 0.8513888888888889 | 3.525 |
| 0.8520833333333333 | 3.525 |
| 0.8527777777777777 | 3.525 |
| 0.8534722222222223 | 3.525 |
| 0.8541666666666666 | 3.525 |
| 0.8548611111111111 | 3.525 |
| 0.8555555555555556 | 3.525 |
| 0.8562500000000001 | 3.525 |
| 0.8569444444444444 | 3.525 |
| 0.8576388888888888 | 3.525 |
| 0.8583333333333334 | 3.525 |
| 0.8590277777777778 | 0 |
| 0.8597222222222222 | 0 |
| 0.8604166666666666 | 0 |
| 0.8611111111111112 | 0 |
| 0.8618055555555556 | 0 |
| 0.8624999999999999 | 0 |
| 0.8631944444444444 | 0 |
| 0.8638888888888889 | 0 |
| 0.8645833333333334 | 0 |
| 0.8652777777777777 | 0 |
| 0.8659722222222223 | 0 |
| 0.8666666666666667 | 0 |
| 0.8673611111111111 | 0 |
| 0.8680555555555555 | 0 |
| 0.86875 | 0 |
| 0.8694444444444445 | 0 |
| 0.8701388888888889 | 0 |
| 0.8708333333333332 | 0 |
| 0.8715277777777778 | 0 |
| 0.8722222222222222 | 0 |
| 0.8729166666666667 | 0 |
| 0.873611111111111 | 0 |
| 0.8743055555555556 | 0 |
| 0.875 | 0 |
| 0.8756944444444444 | 0 |
| 0.876388888888889 | 0 |
| 0.8770833333333333 | 0 |
| 0.8777777777777778 | 0 |
| 0.8784722222222222 | 0 |
| 0.8791666666666668 | 0 |
| 0.8798611111111111 | 0 |
| 0.8805555555555555 | 0 |
| 0.88125 | 0 |
| 0.8819444444444445 | 0 |
| 0.8826388888888889 | 0 |
| 0.8833333333333333 | 0 |
| 0.8840277777777777 | 0 |
| 0.8847222222222223 | 0 |
| 0.8854166666666666 | 0 |
| 0.8861111111111111 | 0 |
| 0.8868055555555556 | 0 |
| 0.8875000000000001 | 0 |
| 0.8881944444444444 | 0 |
| 0.8888888888888888 | 0 |
| 0.8895833333333334 | 0 |
| 0.8902777777777778 | 0 |
| 0.8909722222222222 | 0 |
| 0.8916666666666666 | 0 |
| 0.8923611111111112 | 0 |
| 0.8930555555555556 | 0 |
| 0.8937499999999999 | 0 |
| 0.8944444444444444 | 0 |
| 0.8951388888888889 | 0 |
| 0.8958333333333334 | 0 |
| 0.8965277777777777 | 0 |
| 0.8972222222222223 | 0 |
| 0.8979166666666667 | 0 |
| 0.8986111111111111 | 0 |
| 0.8993055555555555 | 0 |
| 0.9 | 0 |
| 0.9006944444444445 | 0 |
| 0.9013888888888889 | 0 |
| 0.9020833333333332 | 0 |
| 0.9027777777777778 | 0 |
| 0.9034722222222222 | 0 |
| 0.9041666666666667 | 0 |
| 0.904861111111111 | 0 |
| 0.9055555555555556 | 0 |
| 0.90625 | 0 |
| 0.9069444444444444 | 0 |
| 0.907638888888889 | 0 |
| 0.9083333333333333 | 0 |
| 0.9090277777777778 | 0 |
| 0.9097222222222222 | 0 |
| 0.9104166666666668 | 0 |
| 0.9111111111111111 | 0 |
| 0.9118055555555555 | 0 |
| 0.9125 | 0 |
| 0.9131944444444445 | 0 |
| 0.9138888888888889 | 0 |
| 0.9145833333333333 | 0 |
| 0.9152777777777777 | 0 |
| 0.9159722222222223 | 0 |
| 0.9166666666666666 | 0 |
| 0.9173611111111111 | 0 |
| 0.9180555555555556 | 0 |
| 0.9187500000000001 | 0 |
| 0.9194444444444444 | 0 |
| 0.9201388888888888 | 0 |
| 0.9208333333333334 | 0 |
| 0.9215277777777778 | 0 |
| 0.9222222222222222 | 0 |
| 0.9229166666666666 | 0 |
| 0.9236111111111112 | 0 |
| 0.9243055555555556 | 0 |
| 0.9249999999999999 | 0 |
| 0.9256944444444444 | 0 |
| 0.9263888888888889 | 0 |
| 0.9270833333333334 | 0 |
| 0.9277777777777777 | 0 |
| 0.9284722222222223 | 0 |
| 0.9291666666666667 | 0 |
| 0.9298611111111111 | 0 |
| 0.9305555555555555 | 0 |
| 0.93125 | 0 |
| 0.9319444444444445 | 0 |
| 0.9326388888888889 | 0 |
| 0.9333333333333332 | 0 |
| 0.9340277777777778 | 0 |
| 0.9347222222222222 | 0 |
| 0.9354166666666667 | 0 |
| 0.936111111111111 | 0 |
| 0.9368055555555556 | 0 |
| 0.9375 | 0 |
| 0.9381944444444444 | 0 |
| 0.938888888888889 | 0 |
| 0.9395833333333333 | 0 |
| 0.9402777777777778 | 0 |
| 0.9409722222222222 | 0 |
| 0.9416666666666668 | 0 |
| 0.9423611111111111 | 0 |
| 0.9430555555555555 | 0 |
| 0.94375 | 0 |
| 0.9444444444444445 | 0 |
| 0.9451388888888889 | 0 |
| 0.9458333333333333 | 0 |
| 0.9465277777777777 | 0 |
| 0.9472222222222223 | 0 |
| 0.9479166666666666 | 0 |
| 0.9486111111111111 | 0 |
| 0.9493055555555556 | 0 |
| 0.9500000000000001 | 0 |
| 0.9506944444444444 | 0 |
| 0.9513888888888888 | 0 |
| 0.9520833333333334 | 0 |
| 0.9527777777777778 | 0 |
| 0.9534722222222222 | 0 |
| 0.9541666666666666 | 0 |
| 0.9548611111111112 | 0 |
| 0.9555555555555556 | 0 |
| 0.9562499999999999 | 0 |
| 0.9569444444444444 | 0 |
| 0.9576388888888889 | 0 |
| 0.9583333333333334 | 0 |
| 0.9590277777777777 | 0 |
| 0.9597222222222223 | 0 |
| 0.9604166666666667 | 0 |
| 0.9611111111111111 | 0 |
| 0.9618055555555555 | 0 |
| 0.9625 | 0 |
| 0.9631944444444445 | 0 |
| 0.9638888888888889 | 0 |
| 0.9645833333333332 | 0 |
| 0.9652777777777778 | 0 |
| 0.9659722222222222 | 0 |
| 0.9666666666666667 | 0 |
| 0.967361111111111 | 0 |
| 0.9680555555555556 | 0 |
| 0.96875 | 0 |
| 0.9694444444444444 | 0 |
| 0.970138888888889 | 0 |
| 0.9708333333333333 | 0 |
| 0.9715277777777778 | 0 |
| 0.9722222222222222 | 0 |
| 0.9729166666666668 | 0 |
| 0.9736111111111111 | 0 |
| 0.9743055555555555 | 0 |
| 0.975 | 0 |
| 0.9756944444444445 | 0 |
| 0.9763888888888889 | 0 |
| 0.9770833333333333 | 0 |
| 0.9777777777777777 | 0 |
| 0.9784722222222223 | 0 |
| 0.9791666666666666 | 0 |
| 0.9798611111111111 | 0 |
| 0.9805555555555556 | 0 |
| 0.9812500000000001 | 0 |
| 0.9819444444444444 | 0 |
| 0.9826388888888888 | 0 |
| 0.9833333333333334 | 0 |
| 0.9840277777777778 | 0 |
| 0.9847222222222222 | 0 |
| 0.9854166666666666 | 0 |
| 0.9861111111111112 | 0 |
| 0.9868055555555556 | 0 |
| 0.9874999999999999 | 0 |
| 0.9881944444444444 | 0 |
| 0.9888888888888889 | 0 |
| 0.9895833333333334 | 0 |
| 0.9902777777777777 | 0 |
| 0.9909722222222223 | 0 |
| 0.9916666666666667 | 0 |
| 0.9923611111111111 | 0 |
| 0.9930555555555555 | 0 |
| 0.99375 | 0 |
| 0.9944444444444445 | 0 |
| 0.9951388888888889 | 0 |
| 0.9958333333333332 | 0 |
| 0.9965277777777778 | 0 |
| 0.9972222222222222 | 0 |
| 0.9979166666666667 | 0 |
| 0.998611111111111 | 0 |
| 0.9993055555555556 | 0 |